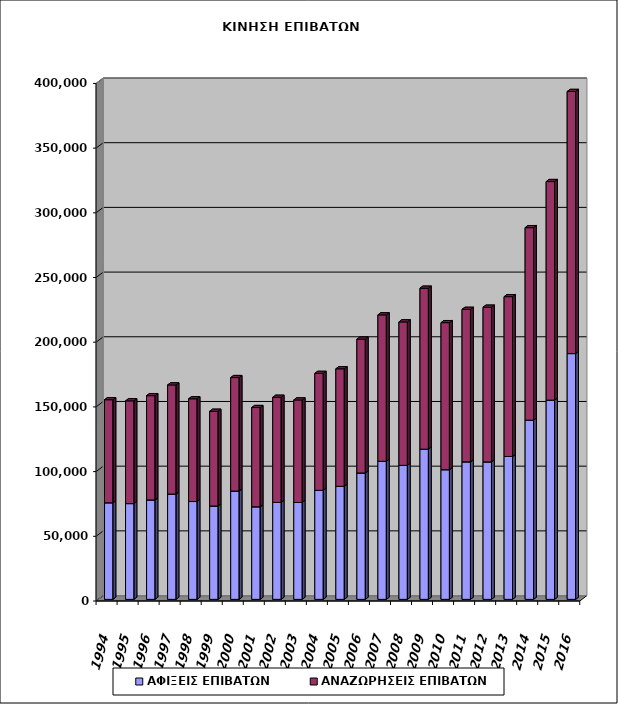
| Category | ΑΦΙΞΕΙΣ ΕΠΙΒΑΤΩΝ | ΑΝΑΖΩΡΗΣΕΙΣ ΕΠΙΒΑΤΩΝ |
|---|---|---|
| 1994.0 | 74650 | 79638 |
| 1995.0 | 74022 | 79395 |
| 1996.0 | 76857 | 80568 |
| 1997.0 | 81386 | 84333 |
| 1998.0 | 75623 | 79399 |
| 1999.0 | 72171 | 73191 |
| 2000.0 | 83700 | 87707 |
| 2001.0 | 71545 | 76712 |
| 2002.0 | 74957 | 81220 |
| 2003.0 | 74913 | 79203 |
| 2004.0 | 84291 | 90341 |
| 2005.0 | 87342 | 90856 |
| 2006.0 | 97677 | 103436 |
| 2007.0 | 106690 | 113170 |
| 2008.0 | 103580 | 110856 |
| 2009.0 | 116092 | 124369 |
| 2010.0 | 100219 | 113633 |
| 2011.0 | 106295 | 117830 |
| 2012.0 | 106254 | 119535 |
| 2013.0 | 110430 | 123519 |
| 2014.0 | 138529 | 148736 |
| 2015.0 | 153963 | 168938 |
| 2016.0 | 189963 | 202562 |